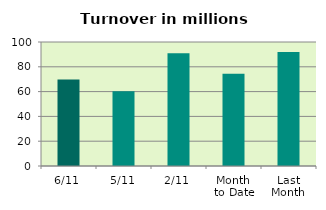
| Category | Series 0 |
|---|---|
| 6/11 | 69.847 |
| 5/11 | 60.241 |
| 2/11 | 90.902 |
| Month 
to Date | 74.453 |
| Last
Month | 91.964 |